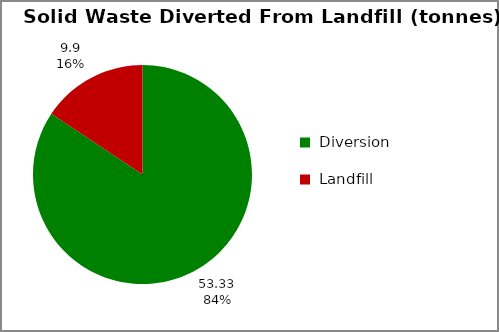
| Category | Series 0 |
|---|---|
| Diversion | 53.33 |
| Landfill | 9.9 |